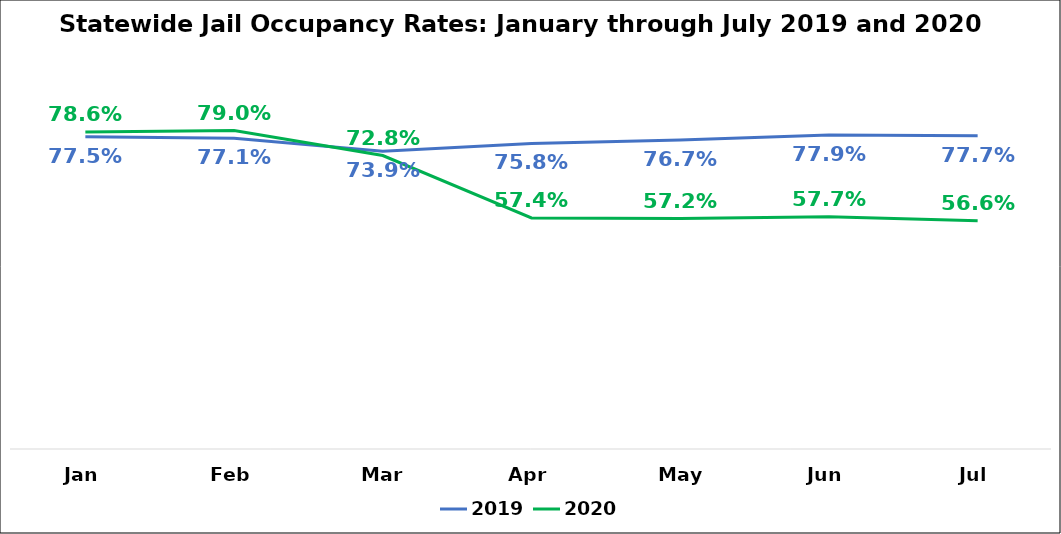
| Category | 2019 | 2020 |
|---|---|---|
| Jan | 0.775 | 0.786 |
| Feb | 0.771 | 0.79 |
| Mar | 0.739 | 0.728 |
| Apr | 0.758 | 0.574 |
| May | 0.767 | 0.572 |
| Jun | 0.779 | 0.577 |
| Jul | 0.777 | 0.566 |